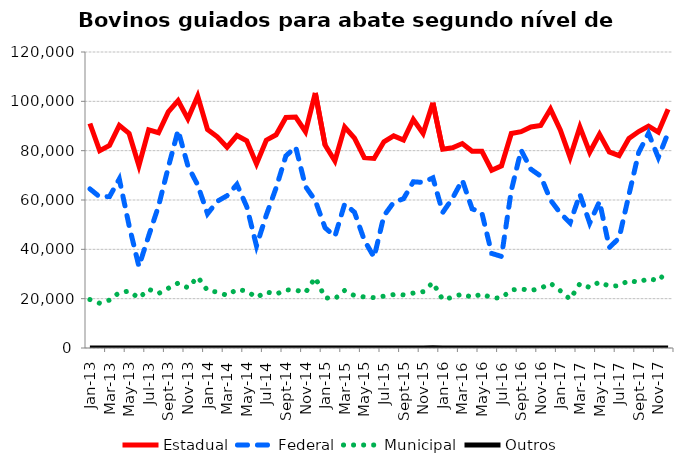
| Category | Estadual | Federal | Municipal | Outros |
|---|---|---|---|---|
| 2013-01-01 | 91018 | 64501 | 19639 | 11 |
| 2013-02-01 | 79966 | 61269 | 18137 | 0 |
| 2013-03-01 | 82111 | 61384 | 19416 | 0 |
| 2013-04-01 | 90261 | 68516 | 22472 | 0 |
| 2013-05-01 | 86995 | 49620 | 23067 | 0 |
| 2013-06-01 | 73899 | 33084 | 20230 | 0 |
| 2013-07-01 | 88445 | 45484 | 23851 | 0 |
| 2013-08-01 | 87267 | 57477 | 22085 | 0 |
| 2013-09-01 | 95686 | 73288 | 24220 | 0 |
| 2013-10-01 | 100314 | 88271 | 26304 | 0 |
| 2013-11-01 | 92909 | 73816 | 24423 | 0 |
| 2013-12-01 | 102112 | 66071 | 28791 | 0 |
| 2014-01-01 | 88610 | 54414 | 23317 | 0 |
| 2014-02-01 | 85613 | 59476 | 22684 | 0 |
| 2014-03-01 | 81406 | 61747 | 21325 | 0 |
| 2014-04-01 | 86135 | 66325 | 23780 | 0 |
| 2014-05-01 | 83996 | 57352 | 23063 | 0 |
| 2014-06-01 | 74651 | 41390 | 20488 | 0 |
| 2014-07-01 | 84253 | 53857 | 22739 | 0 |
| 2014-08-01 | 86439 | 64907 | 21819 | 0 |
| 2014-09-01 | 93432 | 77883 | 23553 | 0 |
| 2014-10-01 | 93614 | 81522 | 23491 | 0 |
| 2014-11-01 | 87668 | 65470 | 22475 | 0 |
| 2014-12-01 | 103407 | 59740 | 28560 | 0 |
| 2015-01-01 | 82251 | 48725 | 20365 | 0 |
| 2015-02-01 | 75811 | 45257 | 19964 | 0 |
| 2015-03-01 | 89586 | 58417 | 23365 | 0 |
| 2015-04-01 | 85095 | 55023 | 21220 | 0 |
| 2015-05-01 | 77214 | 43724 | 20706 | 0 |
| 2015-06-01 | 76833 | 36771 | 20422 | 0 |
| 2015-07-01 | 83610 | 53604 | 21000 | 10 |
| 2015-08-01 | 85994 | 59057 | 21666 | 0 |
| 2015-09-01 | 84323 | 60516 | 21549 | 0 |
| 2015-10-01 | 92630 | 67383 | 22270 | 0 |
| 2015-11-01 | 86973 | 67127 | 22832 | 0 |
| 2015-12-01 | 99418 | 68978 | 26525 | 82 |
| 2016-01-01 | 80597 | 54933 | 19609 | 0 |
| 2016-02-01 | 81194 | 60711 | 20568 | 0 |
| 2016-03-01 | 82900 | 68066 | 21925 | 0 |
| 2016-04-01 | 79804 | 56435 | 20516 | 0 |
| 2016-05-01 | 79752 | 54739 | 21961 | 0 |
| 2016-06-01 | 72075 | 38342 | 20307 | 0 |
| 2016-07-01 | 73857 | 37118 | 20285 | 0 |
| 2016-08-01 | 86981 | 63858 | 23540 | 0 |
| 2016-09-01 | 87690 | 80232 | 23946 | 0 |
| 2016-10-01 | 89626 | 72480 | 23295 | 0 |
| 2016-11-01 | 90238 | 69687 | 24200 | 0 |
| 2016-12-01 | 96860 | 59973 | 26239 | 0 |
| 2017-01-01 | 88414 | 54660 | 23202 | 0 |
| 2017-02-01 | 77269 | 50690 | 19784 | 0 |
| 2017-03-01 | 89610 | 62333 | 26093 | 0 |
| 2017-04-01 | 79345 | 50645 | 24525 | 0 |
| 2017-05-01 | 86700 | 59408 | 26800 | 0 |
| 2017-06-01 | 79496 | 40743 | 25012 | 0 |
| 2017-07-01 | 77981 | 44566 | 25259 | 7 |
| 2017-08-01 | 84956 | 62038 | 27396 | 0 |
| 2017-09-01 | 87768 | 79281 | 26590 | 0 |
| 2017-10-01 | 89910 | 87048 | 28217 | 0 |
| 2017-11-01 | 87489 | 77207 | 27226 | 0 |
| 2017-12-01 | 96818 | 87208 | 31641 | 0 |